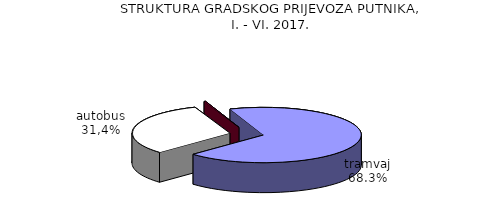
| Category | Series 0 |
|---|---|
| tramvaj | 102315 |
| autobus | 47059 |
| žičara i uspinjača | 374 |